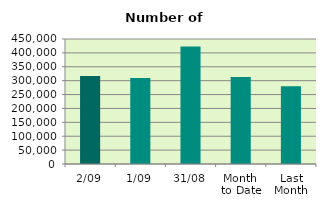
| Category | Series 0 |
|---|---|
| 2/09 | 316728 |
| 1/09 | 310008 |
| 31/08 | 422714 |
| Month 
to Date | 313368 |
| Last
Month | 279794.182 |